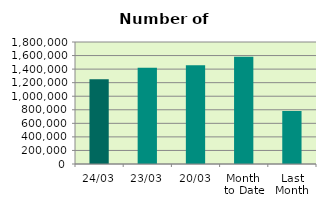
| Category | Series 0 |
|---|---|
| 24/03 | 1249320 |
| 23/03 | 1418440 |
| 20/03 | 1456998 |
| Month 
to Date | 1580668.706 |
| Last
Month | 783511.9 |